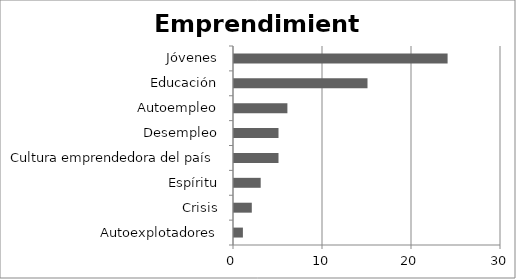
| Category | Emprendimiento |
|---|---|
| Autoexplotadores | 1 |
| Crisis | 2 |
| Espíritu | 3 |
| Cultura emprendedora del país | 5 |
| Desempleo | 5 |
| Autoempleo | 6 |
| Educación | 15 |
| Jóvenes | 24 |